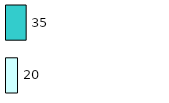
| Category | Series 0 | Series 1 |
|---|---|---|
| 0 | 20 | 35 |